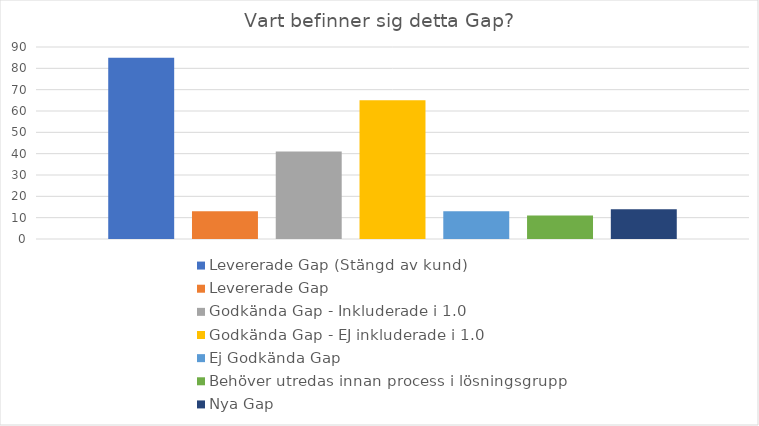
| Category | Levererade Gap (Stängd av kund) | Levererade Gap | Godkända Gap - Inkluderade i 1.0 | Godkända Gap - EJ inkluderade i 1.0 | Ej Godkända Gap | Behöver utredas innan process i lösningsgrupp | Nya Gap |
|---|---|---|---|---|---|---|---|
| 0 | 85 | 13 | 41 | 65 | 13 | 11 | 14 |